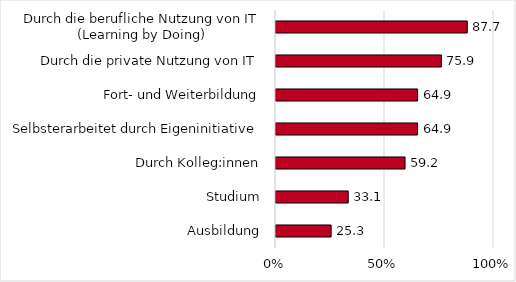
| Category | Series 0 |
|---|---|
| Ausbildung | 25.287 |
| Studium | 33.142 |
| Durch Kolleg:innen | 59.195 |
| Selbsterarbeitet durch Eigeninitiative | 64.943 |
| Fort- und Weiterbildung | 64.943 |
| Durch die private Nutzung von IT | 75.862 |
| Durch die berufliche Nutzung von IT (Learning by Doing) | 87.739 |